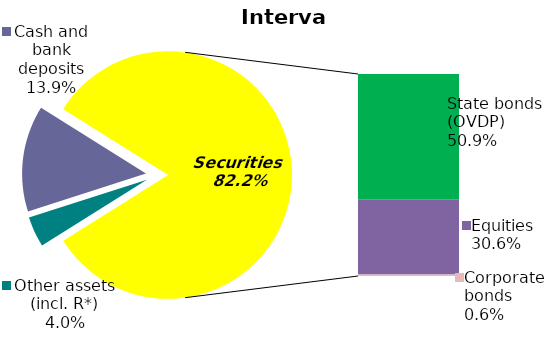
| Category | Series 0 |
|---|---|
| Other assets (incl. R*) | 0.04 |
| Cash and bank deposits | 0.139 |
| Bank metals | 0 |
| State bonds (OVDP) | 0.509 |
| Municipal bonds | 0 |
| Equities | 0.306 |
| Corporate bonds | 0.006 |